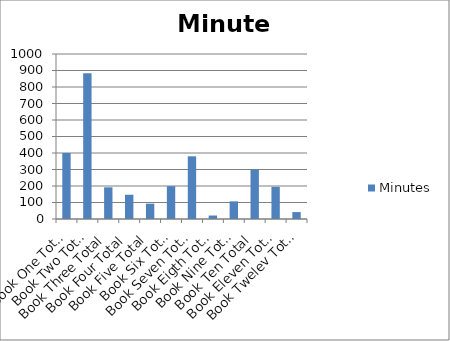
| Category | Minutes |
|---|---|
| Book One Total | 400 |
| Book Two Total | 883 |
| Book Three Total | 192 |
| Book Four Total | 147 |
| Book Five Total | 93 |
| Book Six Total | 199 |
| Book Seven Total | 380 |
| Book Eigth Total | 21 |
| Book Nine Total | 107 |
| Book Ten Total | 300 |
| Book Eleven Total | 195 |
| Book Twelev Total | 42 |